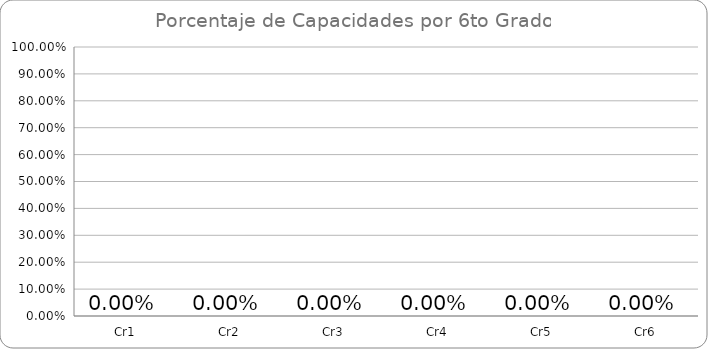
| Category | Series 0 |
|---|---|
| Cr1 | 0 |
| Cr2 | 0 |
| Cr3 | 0 |
| Cr4 | 0 |
| Cr5 | 0 |
| Cr6 | 0 |